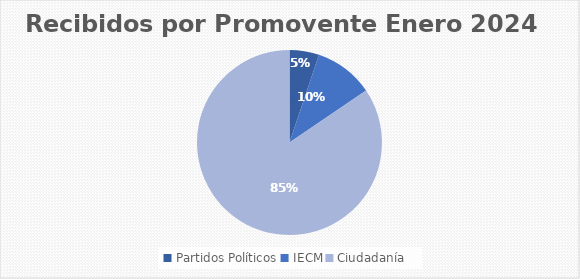
| Category | Recibidos por Promovente ENERO |
|---|---|
| Partidos Políticos | 3 |
| IECM | 6 |
| Ciudadanía  | 49 |